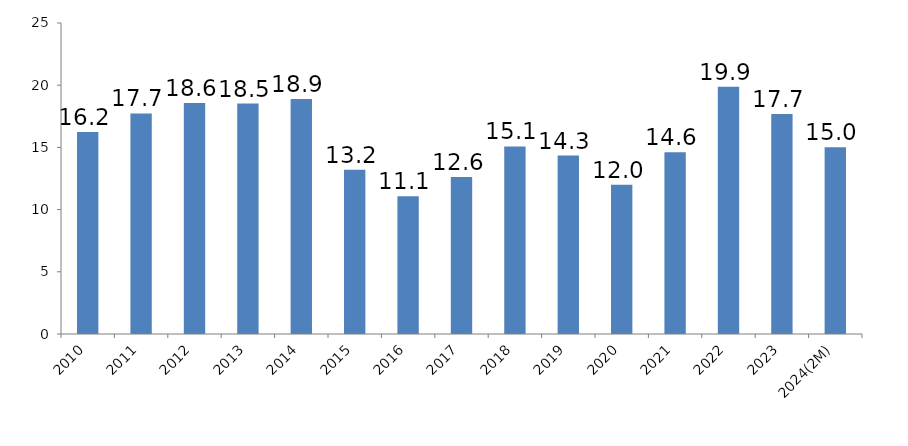
| Category | Value of Imported Energy : Total Import (%) |
|---|---|
| 2010 | 16.24 |
| 2011 | 17.73 |
| 2012 | 18.57 |
| 2013 | 18.52 |
| 2014 | 18.9 |
| 2015 | 13.2 |
| 2016 | 11.07 |
| 2017 | 12.63 |
| 2018 | 15.08 |
| 2019 | 14.34 |
| 2020 | 12 |
| 2021 | 14.61 |
| 2022 | 19.87 |
| 2023 | 17.69 |
| 2024(2M) | 15.02 |